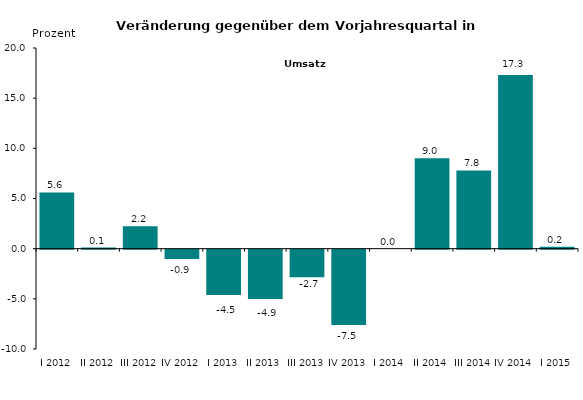
| Category | Series 0 |
|---|---|
| I 2012 | 5.603 |
| II 2012 | 0.11 |
| III 2012 | 2.228 |
| IV 2012 | -0.936 |
| I 2013 | -4.513 |
| II 2013 | -4.922 |
| III 2013 | -2.749 |
| IV 2013 | -7.5 |
| I 2014 | 0 |
| II 2014 | 9 |
| III 2014 | 7.8 |
| IV 2014 | 17.3 |
| I 2015 | 0.2 |